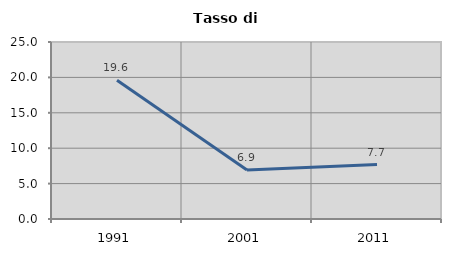
| Category | Tasso di disoccupazione   |
|---|---|
| 1991.0 | 19.596 |
| 2001.0 | 6.925 |
| 2011.0 | 7.692 |